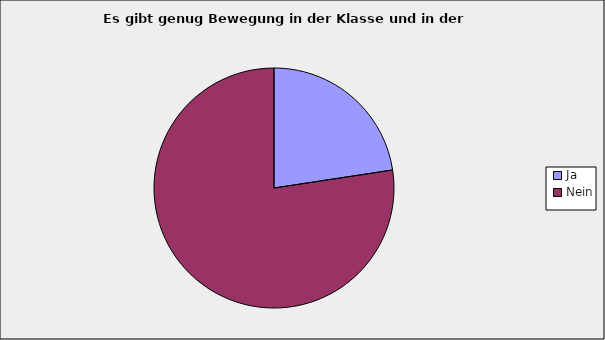
| Category | Series 0 |
|---|---|
| Ja | 0.226 |
| Nein | 0.774 |